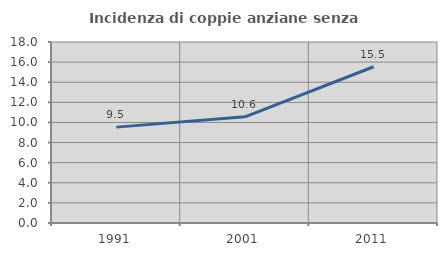
| Category | Incidenza di coppie anziane senza figli  |
|---|---|
| 1991.0 | 9.534 |
| 2001.0 | 10.555 |
| 2011.0 | 15.541 |